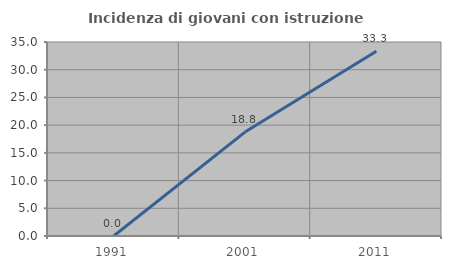
| Category | Incidenza di giovani con istruzione universitaria |
|---|---|
| 1991.0 | 0 |
| 2001.0 | 18.75 |
| 2011.0 | 33.333 |